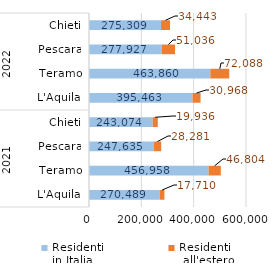
| Category | Residenti 
in Italia | Residenti
 all'estero |
|---|---|---|
| 0 | 270489 | 17710 |
| 1 | 456958 | 46804 |
| 2 | 247635 | 28281 |
| 3 | 243074 | 19936 |
| 4 | 395463 | 30968 |
| 5 | 463860 | 72088 |
| 6 | 277927 | 51036 |
| 7 | 275309 | 34443 |